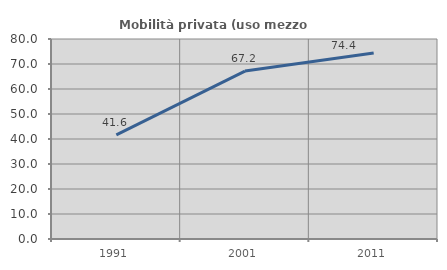
| Category | Mobilità privata (uso mezzo privato) |
|---|---|
| 1991.0 | 41.626 |
| 2001.0 | 67.171 |
| 2011.0 | 74.439 |